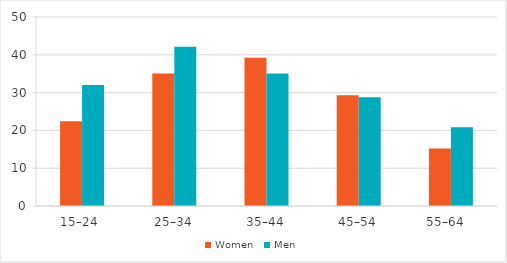
| Category | Women | Men |
|---|---|---|
| 15–24  | 22.439 | 32.011 |
| 25–34 | 35.072 | 42.129 |
| 35–44 | 39.246 | 35.032 |
| 45–54 | 29.319 | 28.739 |
| 55–64   | 15.236 | 20.852 |